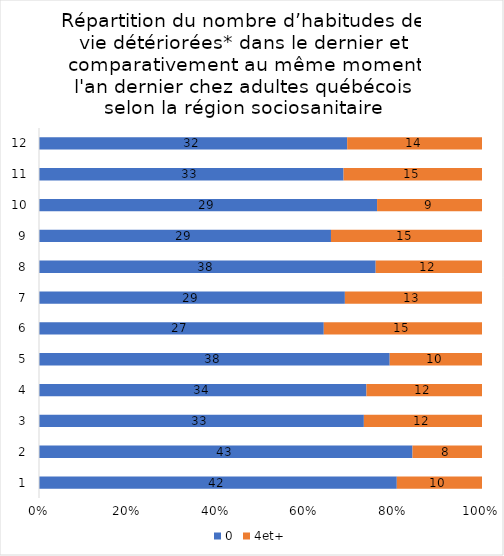
| Category | 0 | 4et+ |
|---|---|---|
| 0 | 42 | 10 |
| 1 | 43 | 8 |
| 2 | 33 | 12 |
| 3 | 34 | 12 |
| 4 | 38 | 10 |
| 5 | 27 | 15 |
| 6 | 29 | 13 |
| 7 | 38 | 12 |
| 8 | 29 | 15 |
| 9 | 29 | 9 |
| 10 | 33 | 15 |
| 11 | 32 | 14 |